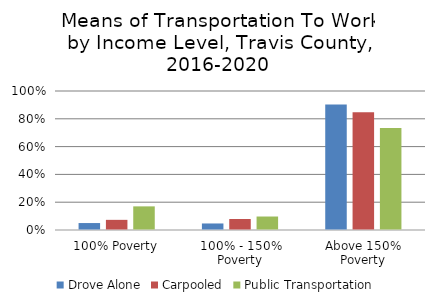
| Category | Drove Alone | Carpooled | Public Transportation |
|---|---|---|---|
| 100% Poverty | 0.05 | 0.073 | 0.17 |
| 100% - 150% Poverty | 0.047 | 0.079 | 0.097 |
| Above 150% Poverty | 0.903 | 0.848 | 0.733 |